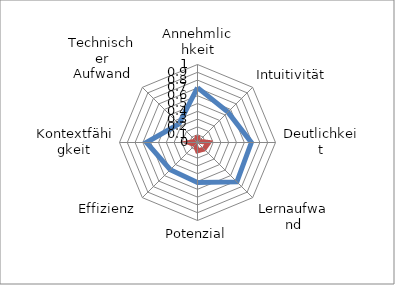
| Category | DHR | Series 1 |
|---|---|---|
| Annehmlichkeit | 0.704 | 0.088 |
| Intuitivität | 0.551 | 0.023 |
| Deutlichkeit | 0.69 | 0.144 |
| Lernaufwand | 0.714 | 0.119 |
| Potenzial | 0.512 | 0.107 |
| Effizienz | 0.494 | 0.041 |
| Kontextfähigkeit | 0.655 | 0.109 |
| Technischer Aufwand | 0.337 | 0.028 |